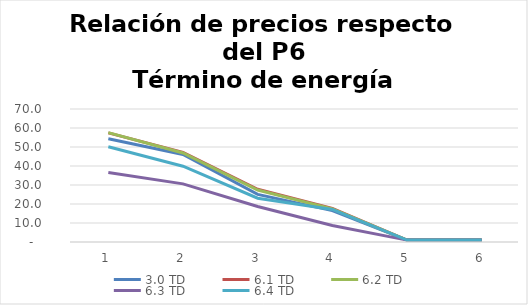
| Category | 3.0 TD | 6.1 TD | 6.2 TD | 6.3 TD | 6.4 TD |
|---|---|---|---|---|---|
| 0 | 54.379 | 57.433 | 57.583 | 36.538 | 50.143 |
| 1 | 46.071 | 47.192 | 46.844 | 30.591 | 39.903 |
| 2 | 25.068 | 27.774 | 27.361 | 18.701 | 23.034 |
| 3 | 16.541 | 17.628 | 17.461 | 8.674 | 17.12 |
| 4 | 1 | 1 | 1 | 1 | 1 |
| 5 | 1 | 1 | 1 | 1 | 1 |